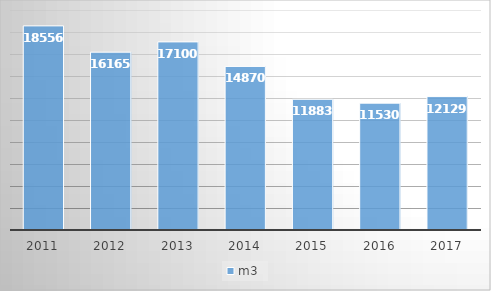
| Category | m3 |
|---|---|
| 2011.0 | 185564 |
| 2012.0 | 161656 |
| 2013.0 | 171003 |
| 2014.0 | 148704 |
| 2015.0 | 118835 |
| 2016.0 | 115308 |
| 2017.0 | 121297 |